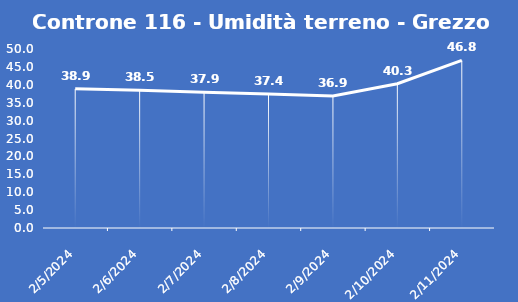
| Category | Controne 116 - Umidità terreno - Grezzo (%VWC) |
|---|---|
| 2/5/24 | 38.9 |
| 2/6/24 | 38.5 |
| 2/7/24 | 37.9 |
| 2/8/24 | 37.4 |
| 2/9/24 | 36.9 |
| 2/10/24 | 40.3 |
| 2/11/24 | 46.8 |